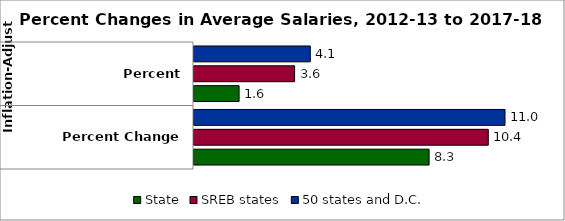
| Category | State | SREB states | 50 states and D.C. |
|---|---|---|---|
| 0 | 8.322 | 10.417 | 11.009 |
| 1 | 1.596 | 3.561 | 4.116 |